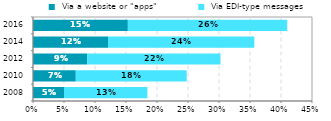
| Category |  Via a website or "apps" |  Via EDI-type messages |
|---|---|---|
|  2008 | 0.05 | 0.135 |
|  2010 | 0.069 | 0.179 |
|  2012 | 0.087 | 0.215 |
|  2014 | 0.121 | 0.236 |
|  2016 | 0.153 | 0.257 |